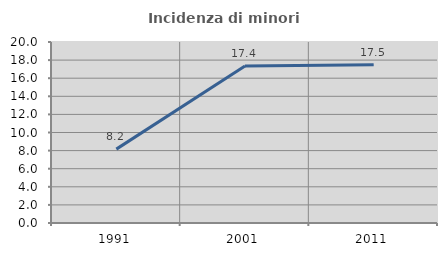
| Category | Incidenza di minori stranieri |
|---|---|
| 1991.0 | 8.163 |
| 2001.0 | 17.355 |
| 2011.0 | 17.476 |